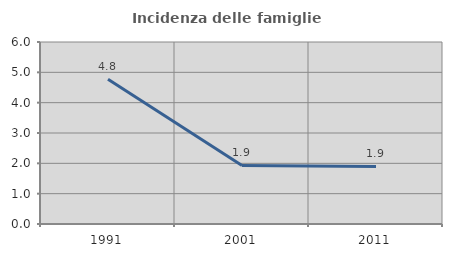
| Category | Incidenza delle famiglie numerose |
|---|---|
| 1991.0 | 4.771 |
| 2001.0 | 1.931 |
| 2011.0 | 1.898 |